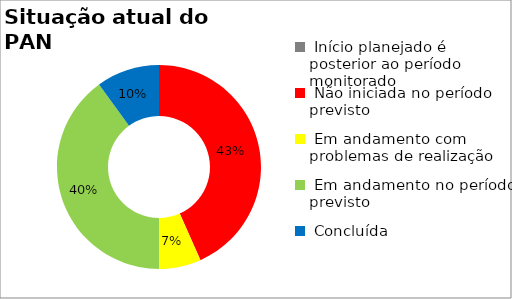
| Category | Series 0 |
|---|---|
|  Início planejado é posterior ao período monitorado | 0 |
|  Não iniciada no período previsto | 0.433 |
|  Em andamento com problemas de realização | 0.067 |
|  Em andamento no período previsto  | 0.4 |
|  Concluída | 0.1 |